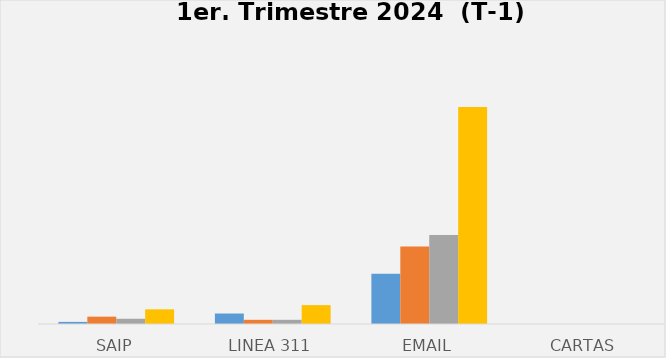
| Category | Series 0 | Series 1 | Series 2 | Series 3 |
|---|---|---|---|---|
| SAIP | 2 | 7 | 5 | 14 |
| Linea 311 | 10 | 4 | 4 | 18 |
| Email | 48 | 74 | 85 | 207 |
| Cartas | 0 | 0 | 0 | 0 |